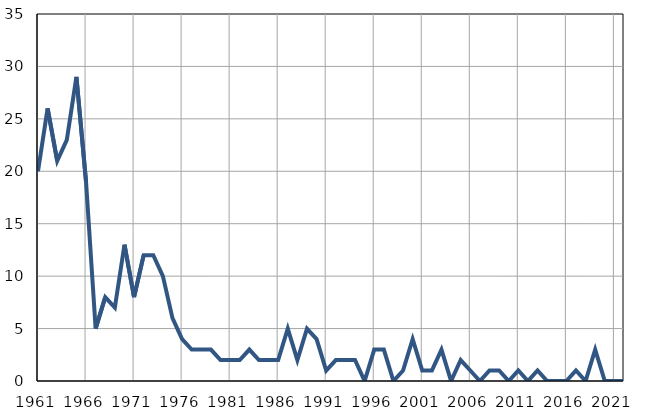
| Category | Infants
deaths |
|---|---|
| 1961.0 | 20 |
| 1962.0 | 26 |
| 1963.0 | 21 |
| 1964.0 | 23 |
| 1965.0 | 29 |
| 1966.0 | 19 |
| 1967.0 | 5 |
| 1968.0 | 8 |
| 1969.0 | 7 |
| 1970.0 | 13 |
| 1971.0 | 8 |
| 1972.0 | 12 |
| 1973.0 | 12 |
| 1974.0 | 10 |
| 1975.0 | 6 |
| 1976.0 | 4 |
| 1977.0 | 3 |
| 1978.0 | 3 |
| 1979.0 | 3 |
| 1980.0 | 2 |
| 1981.0 | 2 |
| 1982.0 | 2 |
| 1983.0 | 3 |
| 1984.0 | 2 |
| 1985.0 | 2 |
| 1986.0 | 2 |
| 1987.0 | 5 |
| 1988.0 | 2 |
| 1989.0 | 5 |
| 1990.0 | 4 |
| 1991.0 | 1 |
| 1992.0 | 2 |
| 1993.0 | 2 |
| 1994.0 | 2 |
| 1995.0 | 0 |
| 1996.0 | 3 |
| 1997.0 | 3 |
| 1998.0 | 0 |
| 1999.0 | 1 |
| 2000.0 | 4 |
| 2001.0 | 1 |
| 2002.0 | 1 |
| 2003.0 | 3 |
| 2004.0 | 0 |
| 2005.0 | 2 |
| 2006.0 | 1 |
| 2007.0 | 0 |
| 2008.0 | 1 |
| 2009.0 | 1 |
| 2010.0 | 0 |
| 2011.0 | 1 |
| 2012.0 | 0 |
| 2013.0 | 1 |
| 2014.0 | 0 |
| 2015.0 | 0 |
| 2016.0 | 0 |
| 2017.0 | 1 |
| 2018.0 | 0 |
| 2019.0 | 3 |
| 2020.0 | 0 |
| 2021.0 | 0 |
| 2022.0 | 0 |